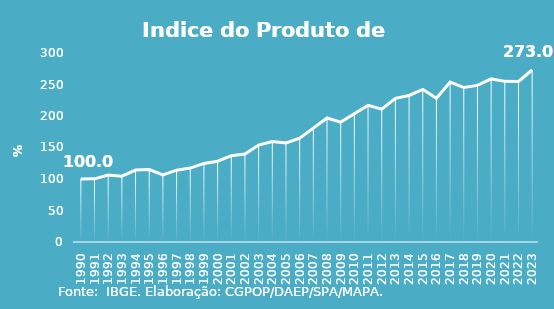
| Category | Indice de Prod. base 1990 |
|---|---|
| 1990.0 | 100 |
| 1991.0 | 100.275 |
| 1992.0 | 106.203 |
| 1993.0 | 104.57 |
| 1994.0 | 114.164 |
| 1995.0 | 115.024 |
| 1996.0 | 106.552 |
| 1997.0 | 114.037 |
| 1998.0 | 117.319 |
| 1999.0 | 124.734 |
| 2000.0 | 128.293 |
| 2001.0 | 136.975 |
| 2002.0 | 139.51 |
| 2003.0 | 153.868 |
| 2004.0 | 159.641 |
| 2005.0 | 157.136 |
| 2006.0 | 164.858 |
| 2007.0 | 180.781 |
| 2008.0 | 196.91 |
| 2009.0 | 190.309 |
| 2010.0 | 203.581 |
| 2011.0 | 217.041 |
| 2012.0 | 210.932 |
| 2013.0 | 228.009 |
| 2014.0 | 232.562 |
| 2015.0 | 242.318 |
| 2016.0 | 228.239 |
| 2017.0 | 253.826 |
| 2018.0 | 245.134 |
| 2019.0 | 248.619 |
| 2020.0 | 258.848 |
| 2021.0 | 254.988 |
| 2022.0 | 254.848 |
| 2023.0 | 273.021 |